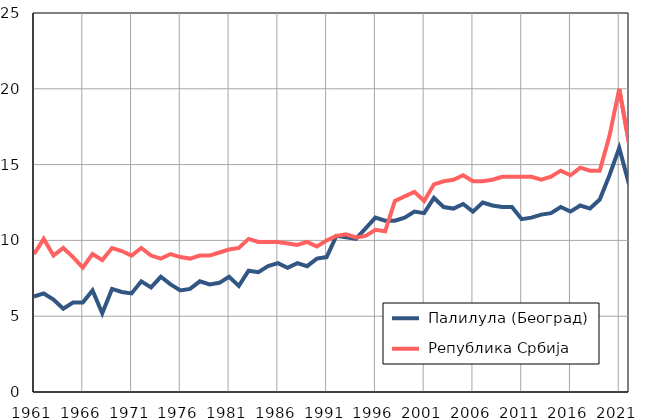
| Category |  Палилула (Београд) |  Република Србија |
|---|---|---|
| 1961.0 | 6.3 | 9.1 |
| 1962.0 | 6.5 | 10.1 |
| 1963.0 | 6.1 | 9 |
| 1964.0 | 5.5 | 9.5 |
| 1965.0 | 5.9 | 8.9 |
| 1966.0 | 5.9 | 8.2 |
| 1967.0 | 6.7 | 9.1 |
| 1968.0 | 5.2 | 8.7 |
| 1969.0 | 6.8 | 9.5 |
| 1970.0 | 6.6 | 9.3 |
| 1971.0 | 6.5 | 9 |
| 1972.0 | 7.3 | 9.5 |
| 1973.0 | 6.9 | 9 |
| 1974.0 | 7.6 | 8.8 |
| 1975.0 | 7.1 | 9.1 |
| 1976.0 | 6.7 | 8.9 |
| 1977.0 | 6.8 | 8.8 |
| 1978.0 | 7.3 | 9 |
| 1979.0 | 7.1 | 9 |
| 1980.0 | 7.2 | 9.2 |
| 1981.0 | 7.6 | 9.4 |
| 1982.0 | 7 | 9.5 |
| 1983.0 | 8 | 10.1 |
| 1984.0 | 7.9 | 9.9 |
| 1985.0 | 8.3 | 9.9 |
| 1986.0 | 8.5 | 9.9 |
| 1987.0 | 8.2 | 9.8 |
| 1988.0 | 8.5 | 9.7 |
| 1989.0 | 8.3 | 9.9 |
| 1990.0 | 8.8 | 9.6 |
| 1991.0 | 8.9 | 10 |
| 1992.0 | 10.3 | 10.3 |
| 1993.0 | 10.2 | 10.4 |
| 1994.0 | 10.1 | 10.2 |
| 1995.0 | 10.8 | 10.3 |
| 1996.0 | 11.5 | 10.7 |
| 1997.0 | 11.3 | 10.6 |
| 1998.0 | 11.3 | 12.6 |
| 1999.0 | 11.5 | 12.9 |
| 2000.0 | 11.9 | 13.2 |
| 2001.0 | 11.8 | 12.6 |
| 2002.0 | 12.8 | 13.7 |
| 2003.0 | 12.2 | 13.9 |
| 2004.0 | 12.1 | 14 |
| 2005.0 | 12.4 | 14.3 |
| 2006.0 | 11.9 | 13.9 |
| 2007.0 | 12.5 | 13.9 |
| 2008.0 | 12.3 | 14 |
| 2009.0 | 12.2 | 14.2 |
| 2010.0 | 12.2 | 14.2 |
| 2011.0 | 11.4 | 14.2 |
| 2012.0 | 11.5 | 14.2 |
| 2013.0 | 11.7 | 14 |
| 2014.0 | 11.8 | 14.2 |
| 2015.0 | 12.2 | 14.6 |
| 2016.0 | 11.9 | 14.3 |
| 2017.0 | 12.3 | 14.8 |
| 2018.0 | 12.1 | 14.6 |
| 2019.0 | 12.7 | 14.6 |
| 2020.0 | 14.3 | 16.9 |
| 2021.0 | 16.1 | 20 |
| 2022.0 | 13.7 | 16.4 |